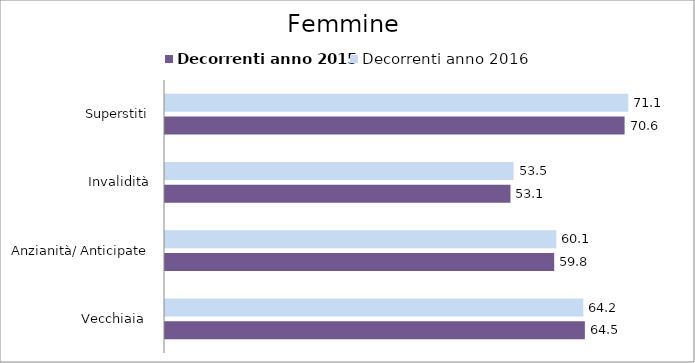
| Category | Decorrenti anno 2015 | Decorrenti anno 2016 |
|---|---|---|
| Vecchiaia  | 64.47 | 64.24 |
| Anzianità/ Anticipate | 59.76 | 60.09 |
| Invalidità | 53.05 | 53.53 |
| Superstiti | 70.57 | 71.14 |